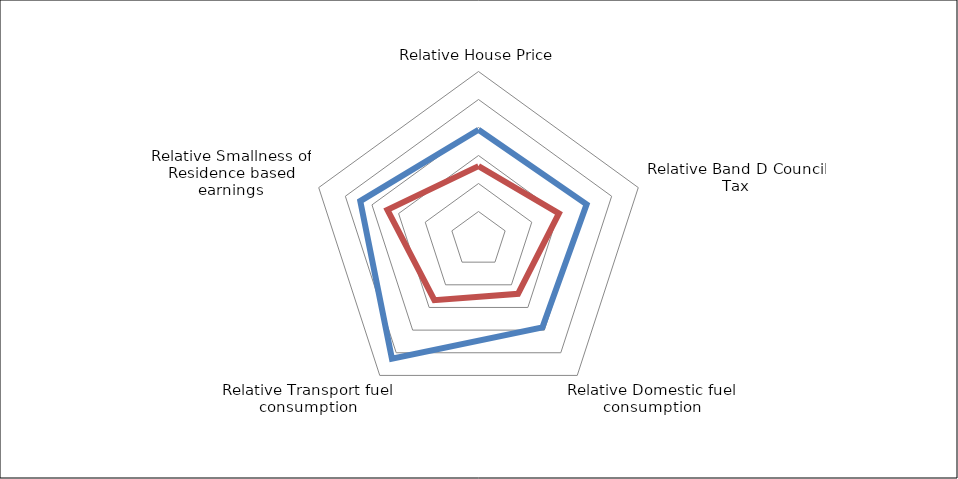
| Category | R80 | OU |
|---|---|---|
| Relative House Price | 196 | 131 |
| Relative Band D Council Tax | 203 | 151 |
| Relative Domestic fuel consumption | 194 | 120 |
| Relative Transport fuel consumption | 263 | 134 |
| Relative Smallness of Residence based earnings | 222 | 171 |